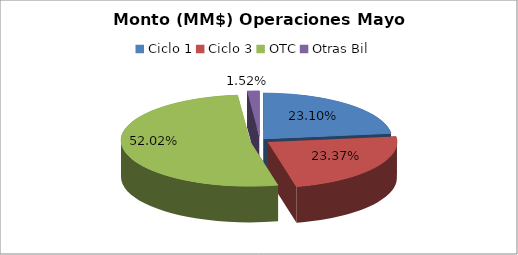
| Category | Series 0 |
|---|---|
| Ciclo 1 | 18046213.572 |
| Ciclo 3 | 18258193.447 |
| OTC | 40638812.154 |
| Otras Bil | 1185202.419 |